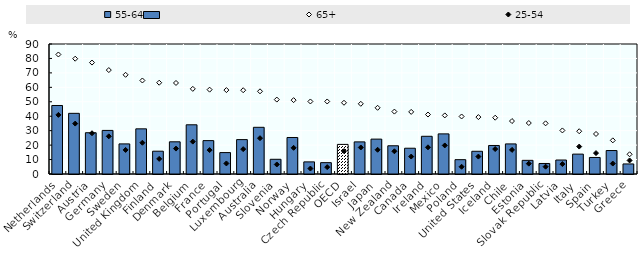
| Category | 55-64 |
|---|---|
| Netherlands | 47.428 |
| Switzerland | 41.995 |
| Austria | 28.571 |
| Germany | 30.176 |
| Sweden | 20.835 |
| United Kingdom | 31.267 |
| Finland | 15.784 |
| Denmark | 22.293 |
| Belgium | 34.068 |
| France | 23.11 |
| Portugal | 14.826 |
| Luxembourg | 23.812 |
| Australia | 32.323 |
| Slovenia | 10.187 |
| Norway | 25.271 |
| Hungary | 8.392 |
| Czech Republic | 7.861 |
| OECD | 20.498 |
| Israel | 22.239 |
| Japan | 24.151 |
| New Zealand | 19.537 |
| Canada | 17.843 |
| Ireland | 26.11 |
| Mexico | 27.774 |
| Poland | 9.925 |
| United States | 15.73 |
| Iceland | 19.744 |
| Chile | 20.832 |
| Estonia | 9.459 |
| Slovak Republic | 7.29 |
| Latvia | 9.688 |
| Italy | 13.763 |
| Spain | 11.448 |
| Turkey | 16.247 |
| Greece | 6.966 |